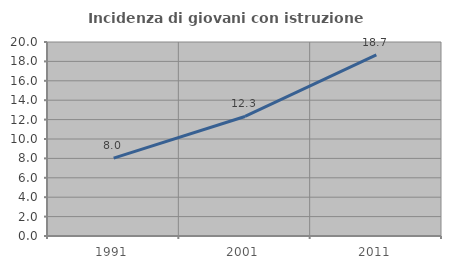
| Category | Incidenza di giovani con istruzione universitaria |
|---|---|
| 1991.0 | 8.025 |
| 2001.0 | 12.325 |
| 2011.0 | 18.662 |